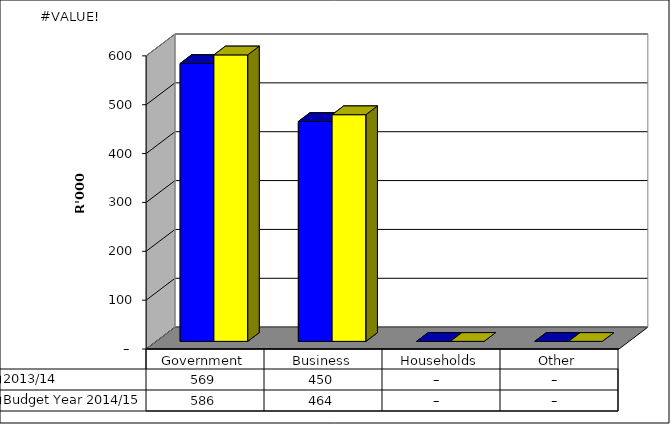
| Category |  2013/14  | Budget Year 2014/15 |
|---|---|---|
| Government | 568784.72 | 586376 |
| Business | 450065.45 | 463985 |
| Households | 0 | 0 |
| Other | 0 | 0 |